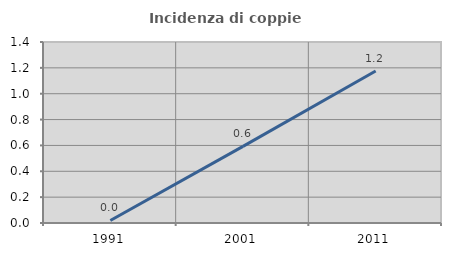
| Category | Incidenza di coppie miste |
|---|---|
| 1991.0 | 0.02 |
| 2001.0 | 0.592 |
| 2011.0 | 1.176 |